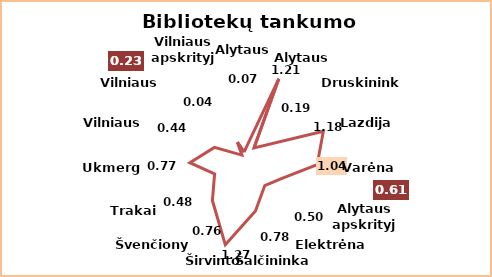
| Category | Series 0 |
|---|---|
| Alytaus m. | 0.07 |
| Alytaus r. | 1.21 |
| Druskininkai | 0.19 |
| Lazdijai | 1.18 |
| Varėna | 1.04 |
| Alytaus apskrityje | 0.61 |
| Elektrėnai | 0.5 |
| Šalčininkai | 0.78 |
| Širvintos | 1.27 |
| Švenčionys | 0.76 |
| Trakai | 0.48 |
| Ukmergė | 0.77 |
| Vilniaus r. | 0.44 |
| Vilniaus m. | 0.04 |
| Vilniaus apskrityje | 0.23 |